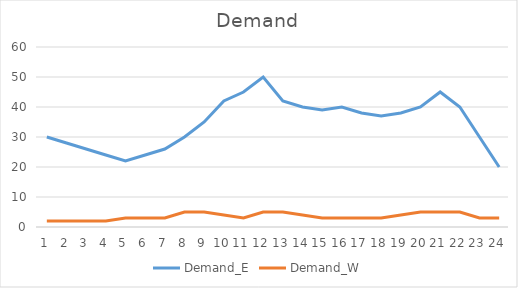
| Category | Demand_E | Demand_W |
|---|---|---|
| 0 | 30 | 2 |
| 1 | 28 | 2 |
| 2 | 26 | 2 |
| 3 | 24 | 2 |
| 4 | 22 | 3 |
| 5 | 24 | 3 |
| 6 | 26 | 3 |
| 7 | 30 | 5 |
| 8 | 35 | 5 |
| 9 | 42 | 4 |
| 10 | 45 | 3 |
| 11 | 50 | 5 |
| 12 | 42 | 5 |
| 13 | 40 | 4 |
| 14 | 39 | 3 |
| 15 | 40 | 3 |
| 16 | 38 | 3 |
| 17 | 37 | 3 |
| 18 | 38 | 4 |
| 19 | 40 | 5 |
| 20 | 45 | 5 |
| 21 | 40 | 5 |
| 22 | 30 | 3 |
| 23 | 20 | 3 |